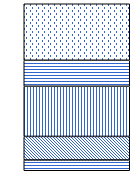
| Category | 18-25 | 25-30 | 30-40 | 40-50 | 50-65 |
|---|---|---|---|---|---|
| 0 | 6.456 | 14.105 | 30.035 | 15.558 | 33.846 |